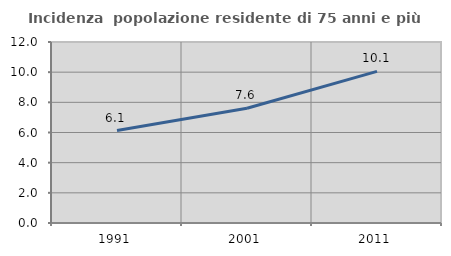
| Category | Incidenza  popolazione residente di 75 anni e più |
|---|---|
| 1991.0 | 6.132 |
| 2001.0 | 7.609 |
| 2011.0 | 10.05 |